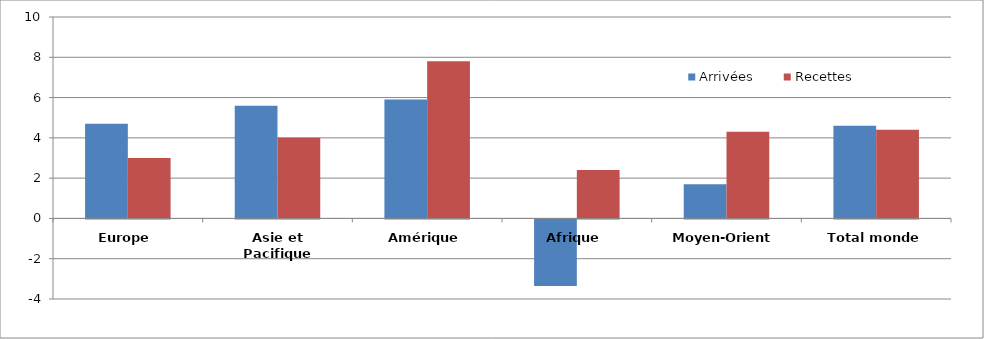
| Category | Arrivées | Recettes |
|---|---|---|
| Europe | 4.7 | 3 |
| Asie et Pacifique | 5.6 | 4 |
| Amérique | 5.9 | 7.8 |
| Afrique | -3.3 | 2.4 |
| Moyen-Orient | 1.7 | 4.3 |
| Total monde | 4.6 | 4.4 |